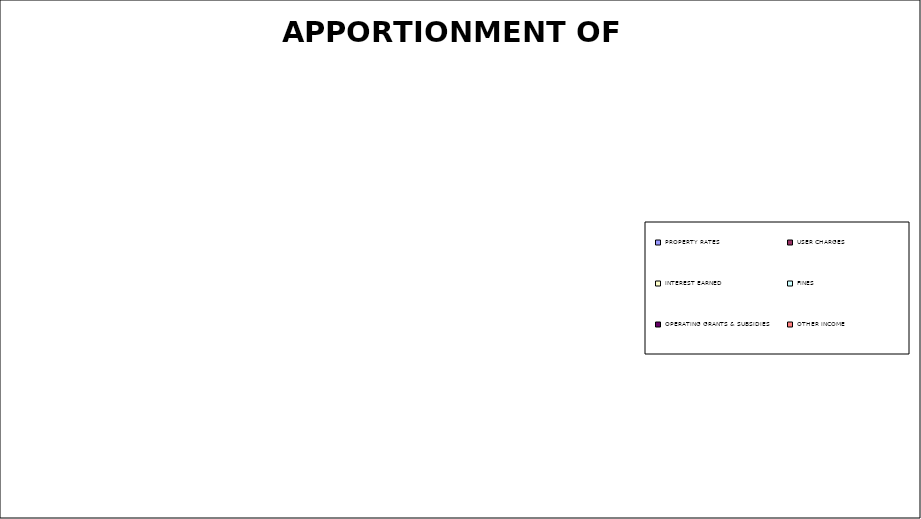
| Category | Series 0 |
|---|---|
| PROPERTY RATES | 0 |
| USER CHARGES | 0 |
| INTEREST EARNED | 0 |
| FINES | 0 |
| OPERATING GRANTS & SUBSIDIES | 0 |
| OTHER INCOME | 0 |